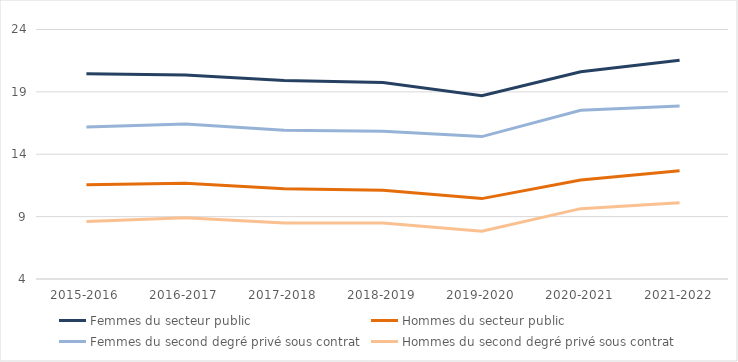
| Category | Femmes du secteur public | Hommes du secteur public | Femmes du second degré privé sous contrat | Hommes du second degré privé sous contrat |
|---|---|---|---|---|
| 2015-2016 | 20.459 | 11.556 | 16.188 | 8.614 |
| 2016-2017 | 20.359 | 11.669 | 16.419 | 8.91 |
| 2017-2018 | 19.916 | 11.232 | 15.928 | 8.494 |
| 2018-2019 | 19.753 | 11.105 | 15.848 | 8.48 |
| 2019-2020 | 18.686 | 10.444 | 15.415 | 7.835 |
| 2020-2021 | 20.617 | 11.937 | 17.526 | 9.638 |
| 2021-2022 | 21.539 | 12.669 | 17.874 | 10.107 |